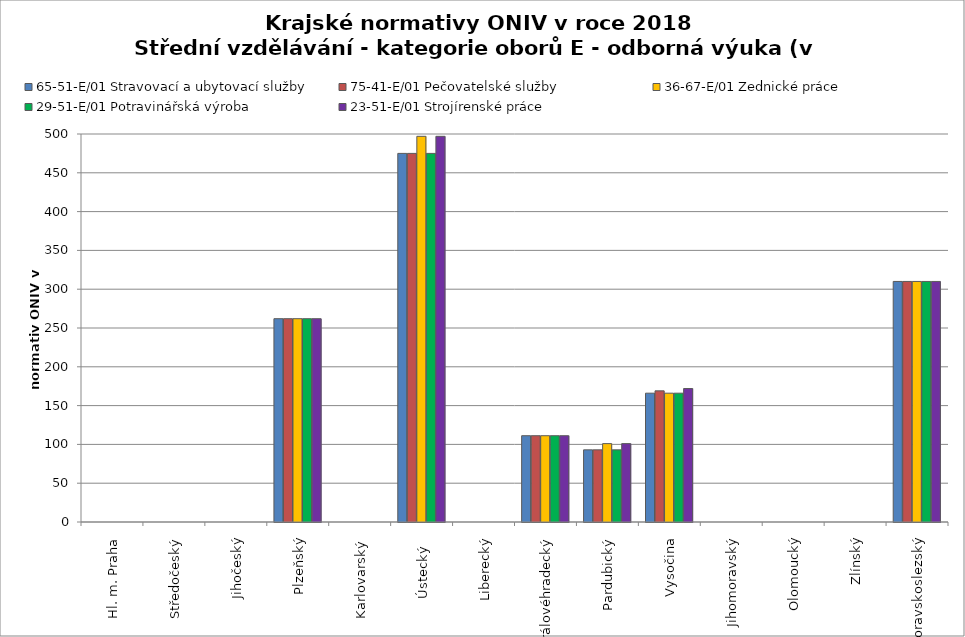
| Category | 65-51-E/01 Stravovací a ubytovací služby | 75-41-E/01 Pečovatelské služby | 36-67-E/01 Zednické práce | 29-51-E/01 Potravinářská výroba | 23-51-E/01 Strojírenské práce |
|---|---|---|---|---|---|
| Hl. m. Praha | 0 | 0 | 0 | 0 | 0 |
| Středočeský | 0 | 0 | 0 | 0 | 0 |
| Jihočeský | 0 | 0 | 0 | 0 | 0 |
| Plzeňský | 262 | 262 | 262 | 262 | 262 |
| Karlovarský  | 0 | 0 | 0 | 0 | 0 |
| Ústecký   | 475 | 475 | 497 | 475 | 497 |
| Liberecký | 0 | 0 | 0 | 0 | 0 |
| Královéhradecký | 111.2 | 111.2 | 111.2 | 111.2 | 111.2 |
| Pardubický | 93 | 93 | 101 | 93 | 101 |
| Vysočina | 166 | 169 | 166 | 166 | 172 |
| Jihomoravský | 0 | 0 | 0 | 0 | 0 |
| Olomoucký | 0 | 0 | 0 | 0 | 0 |
| Zlínský | 0 | 0 | 0 | 0 | 0 |
| Moravskoslezský | 310 | 310 | 310 | 310 | 310 |